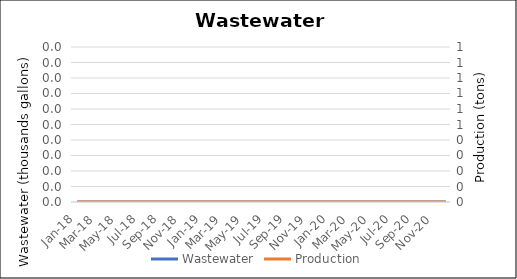
| Category | Wastewater |
|---|---|
| Jan-18 | 0 |
| Feb-18 | 0 |
| Mar-18 | 0 |
| Apr-18 | 0 |
| May-18 | 0 |
| Jun-18 | 0 |
| Jul-18 | 0 |
| Aug-18 | 0 |
| Sep-18 | 0 |
| Oct-18 | 0 |
| Nov-18 | 0 |
| Dec-18 | 0 |
| Jan-19 | 0 |
| Feb-19 | 0 |
| Mar-19 | 0 |
| Apr-19 | 0 |
| May-19 | 0 |
| Jun-19 | 0 |
| Jul-19 | 0 |
| Aug-19 | 0 |
| Sep-19 | 0 |
| Oct-19 | 0 |
| Nov-19 | 0 |
| Dec-19 | 0 |
| Jan-20 | 0 |
| Feb-20 | 0 |
| Mar-20 | 0 |
| Apr-20 | 0 |
| May-20 | 0 |
| Jun-20 | 0 |
| Jul-20 | 0 |
| Aug-20 | 0 |
| Sep-20 | 0 |
| Oct-20 | 0 |
| Nov-20 | 0 |
| Dec-20 | 0 |